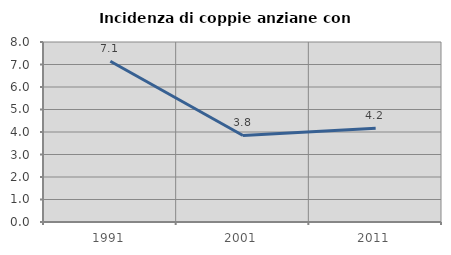
| Category | Incidenza di coppie anziane con figli |
|---|---|
| 1991.0 | 7.143 |
| 2001.0 | 3.846 |
| 2011.0 | 4.167 |